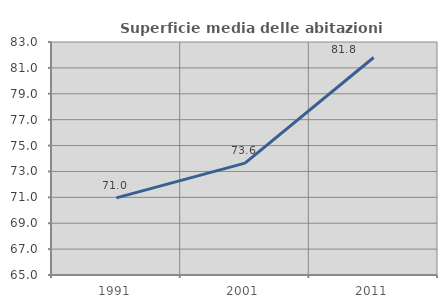
| Category | Superficie media delle abitazioni occupate |
|---|---|
| 1991.0 | 70.956 |
| 2001.0 | 73.646 |
| 2011.0 | 81.801 |